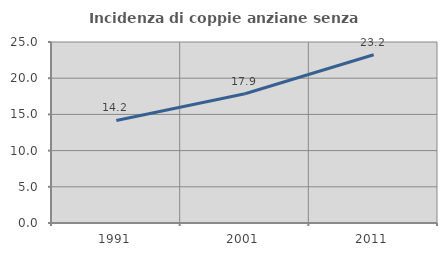
| Category | Incidenza di coppie anziane senza figli  |
|---|---|
| 1991.0 | 14.168 |
| 2001.0 | 17.851 |
| 2011.0 | 23.241 |